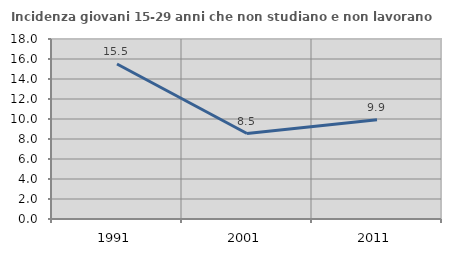
| Category | Incidenza giovani 15-29 anni che non studiano e non lavorano  |
|---|---|
| 1991.0 | 15.502 |
| 2001.0 | 8.547 |
| 2011.0 | 9.917 |